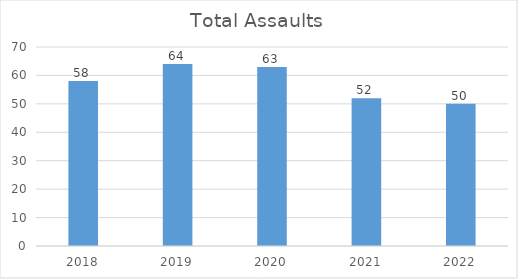
| Category | Total Assaults |
|---|---|
| 2018.0 | 58 |
| 2019.0 | 64 |
| 2020.0 | 63 |
| 2021.0 | 52 |
| 2022.0 | 50 |